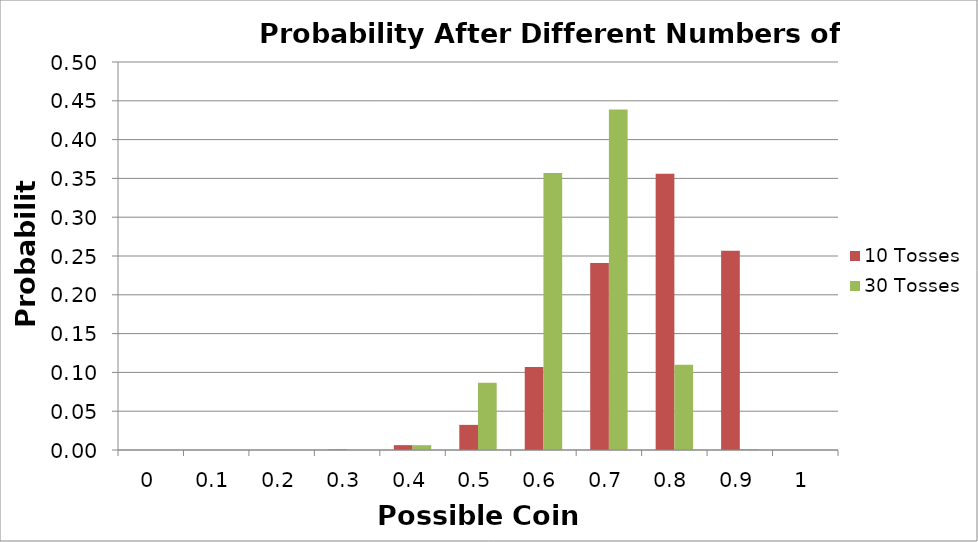
| Category | 10 Tosses | 30 Tosses |
|---|---|---|
| 0.0 | 0 | 0 |
| 0.1 | 0 | 0 |
| 0.2 | 0 | 0 |
| 0.3 | 0.001 | 0 |
| 0.4 | 0.006 | 0.006 |
| 0.5 | 0.032 | 0.087 |
| 0.6 | 0.107 | 0.357 |
| 0.7 | 0.241 | 0.439 |
| 0.8 | 0.356 | 0.11 |
| 0.9 | 0.257 | 0.001 |
| 1.0 | 0 | 0 |